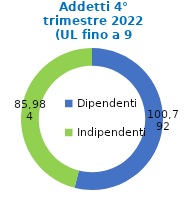
| Category | Series 0 |
|---|---|
| Dipendenti | 100792 |
| Indipendenti | 85984 |